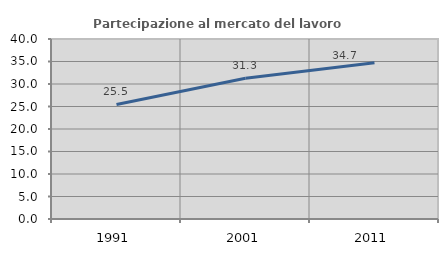
| Category | Partecipazione al mercato del lavoro  femminile |
|---|---|
| 1991.0 | 25.463 |
| 2001.0 | 31.278 |
| 2011.0 | 34.715 |